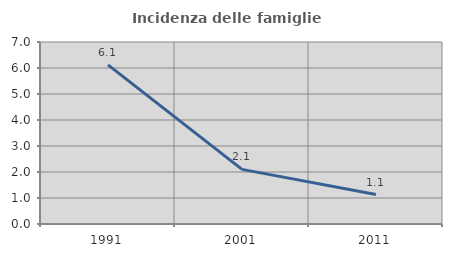
| Category | Incidenza delle famiglie numerose |
|---|---|
| 1991.0 | 6.12 |
| 2001.0 | 2.1 |
| 2011.0 | 1.132 |